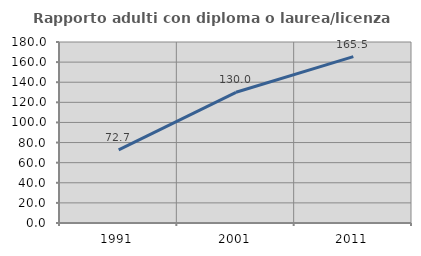
| Category | Rapporto adulti con diploma o laurea/licenza media  |
|---|---|
| 1991.0 | 72.699 |
| 2001.0 | 129.97 |
| 2011.0 | 165.501 |